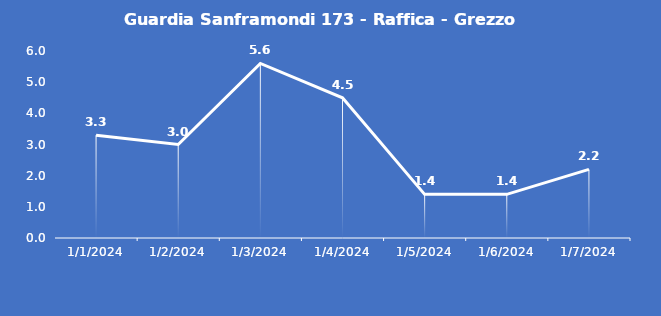
| Category | Guardia Sanframondi 173 - Raffica - Grezzo (m/s) |
|---|---|
| 1/1/24 | 3.3 |
| 1/2/24 | 3 |
| 1/3/24 | 5.6 |
| 1/4/24 | 4.5 |
| 1/5/24 | 1.4 |
| 1/6/24 | 1.4 |
| 1/7/24 | 2.2 |